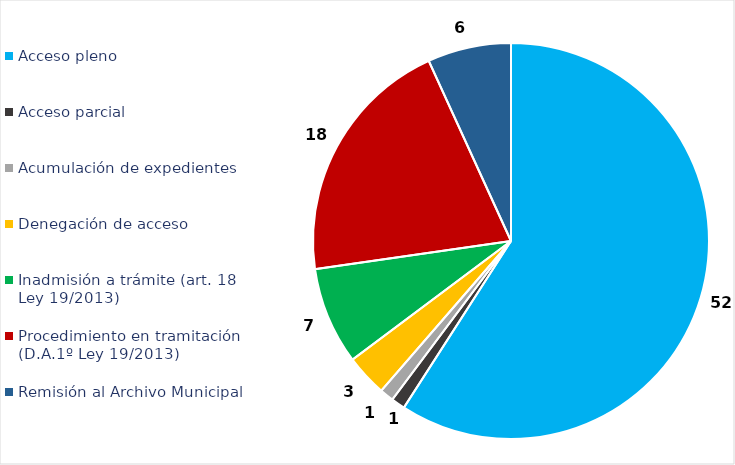
| Category | E |
|---|---|
| Acceso pleno | 52 |
| Acceso parcial | 1 |
| Acumulación de expedientes | 1 |
| Denegación de acceso  | 3 |
| Inadmisión a trámite (art. 18 Ley 19/2013) | 7 |
| Procedimiento en tramitación (D.A.1º Ley 19/2013) | 18 |
| Remisión al Archivo Municipal | 6 |